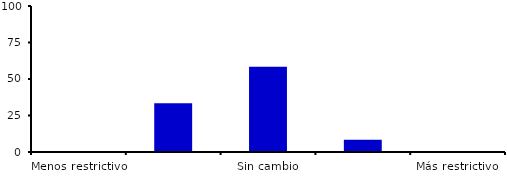
| Category | Series 0 |
|---|---|
| Menos restrictivo | 0 |
| Moderadamente menos restrictivo | 33.333 |
| Sin cambio | 58.333 |
| Moderadamente más restrictivo | 8.333 |
| Más restrictivo | 0 |